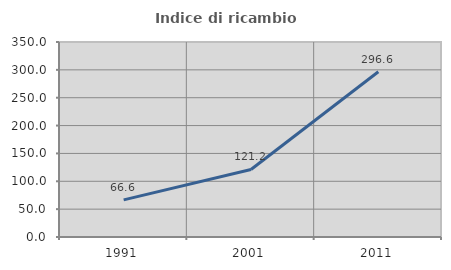
| Category | Indice di ricambio occupazionale  |
|---|---|
| 1991.0 | 66.589 |
| 2001.0 | 121.176 |
| 2011.0 | 296.635 |